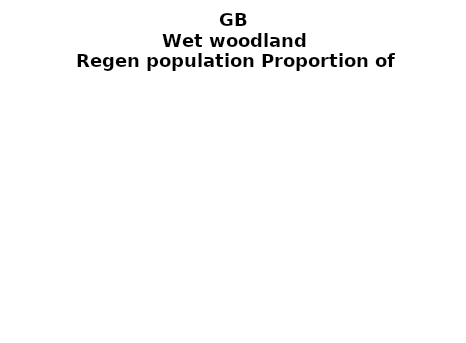
| Category | Wet woodland |
|---|---|
| None | 0.049 |
| Seedlings only | 0 |
| Seedlings, saplings only | 0.014 |
| Seedlings, saplings, <7 cm trees | 0.175 |
| Saplings only | 0.188 |
| <7 cm trees, seedlings only | 0 |
| <7 cm trees, saplings only | 0.5 |
| <7 cm Trees only | 0.074 |